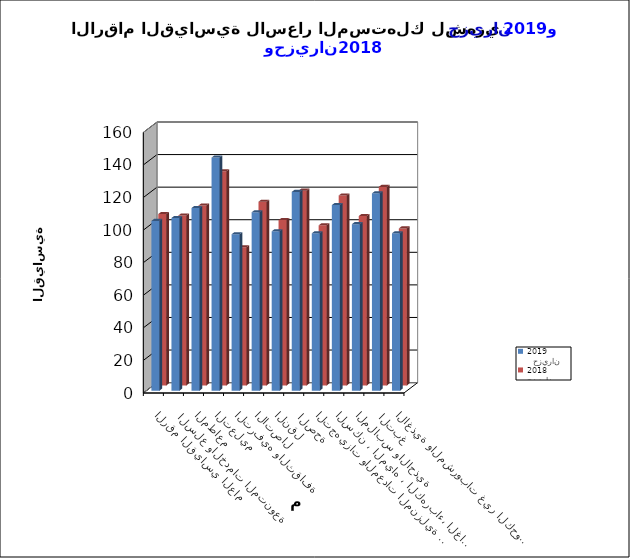
| Category |   حزيران     2019      | حزيران   2018 |
|---|---|---|
| الاغذية والمشروبات غير الكحولية | 96.6 | 96.4 |
|  التبغ | 121.1 | 121.9 |
| الملابس والاحذية | 102.2 | 104 |
| السكن ، المياه ، الكهرباء، الغاز  | 113.9 | 116.6 |
| التجهيزات والمعدات المنزلية والصيانة | 96.6 | 98.3 |
|  الصحة | 122 | 119.6 |
| النقل | 97.8 | 101.5 |
| الاتصال | 109.5 | 112.8 |
| الترفيه والثقافة | 96 | 84.8 |
| التعليم | 143.1 | 131.5 |
| المطاعم  | 112.1 | 110.4 |
|  السلع والخدمات المتنوعة | 106 | 104.3 |
| الرقم القياسي العام | 104.2 | 105.2 |